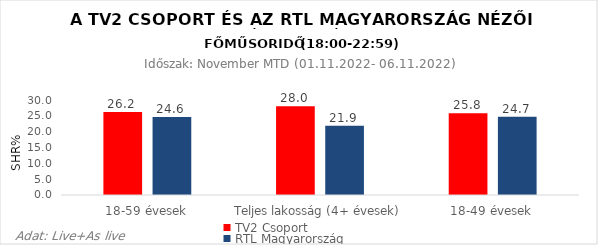
| Category | TV2 Csoport | RTL Magyarország |
|---|---|---|
| 18-59 évesek | 26.2 | 24.6 |
| Teljes lakosság (4+ évesek) | 28 | 21.9 |
| 18-49 évesek | 25.8 | 24.7 |